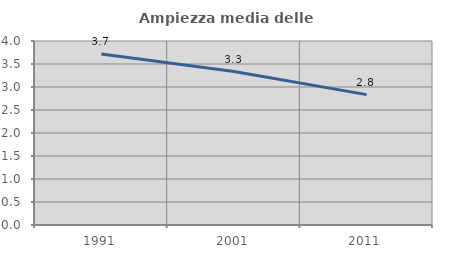
| Category | Ampiezza media delle famiglie |
|---|---|
| 1991.0 | 3.716 |
| 2001.0 | 3.336 |
| 2011.0 | 2.834 |